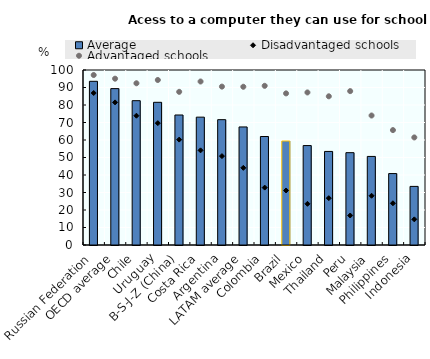
| Category | Average |
|---|---|
| Russian Federation | 93.537 |
| OECD average | 89.359 |
| Chile | 82.471 |
| Uruguay | 81.54 |
| B-S-J-Z (China) | 74.292 |
| Costa Rica | 73.059 |
| Argentina | 71.621 |
| LATAM average | 67.463 |
| Colombia | 61.997 |
| Brazil | 59.435 |
| Mexico | 56.818 |
| Thailand | 53.472 |
| Peru | 52.762 |
| Malaysia | 50.611 |
| Philippines | 40.813 |
| Indonesia | 33.483 |